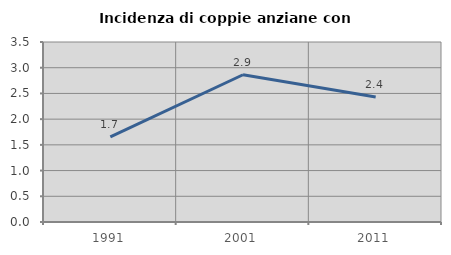
| Category | Incidenza di coppie anziane con figli |
|---|---|
| 1991.0 | 1.654 |
| 2001.0 | 2.863 |
| 2011.0 | 2.43 |